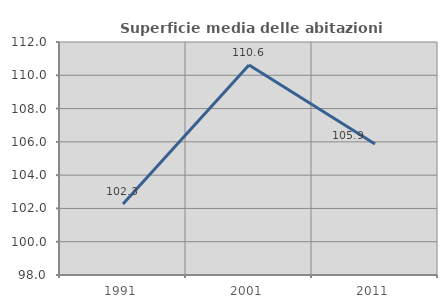
| Category | Superficie media delle abitazioni occupate |
|---|---|
| 1991.0 | 102.272 |
| 2001.0 | 110.619 |
| 2011.0 | 105.874 |